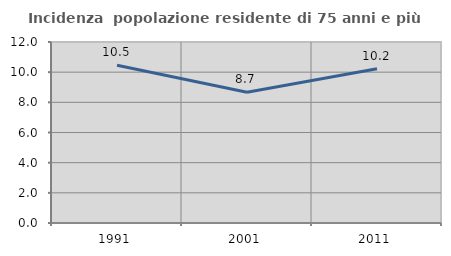
| Category | Incidenza  popolazione residente di 75 anni e più |
|---|---|
| 1991.0 | 10.459 |
| 2001.0 | 8.672 |
| 2011.0 | 10.221 |